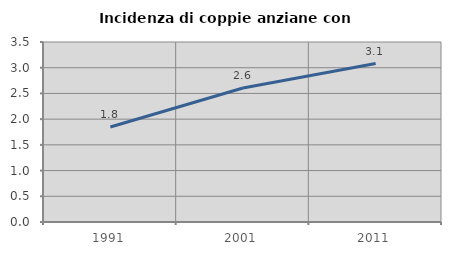
| Category | Incidenza di coppie anziane con figli |
|---|---|
| 1991.0 | 1.846 |
| 2001.0 | 2.605 |
| 2011.0 | 3.082 |